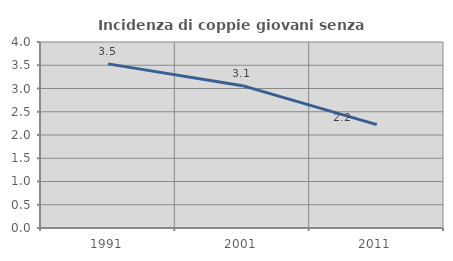
| Category | Incidenza di coppie giovani senza figli |
|---|---|
| 1991.0 | 3.529 |
| 2001.0 | 3.061 |
| 2011.0 | 2.222 |